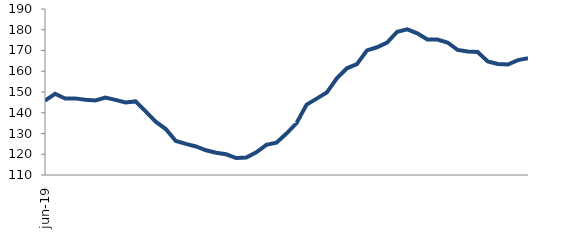
| Category | Series 1 |
|---|---|
| 2019-06-01 | 145.804 |
| 2019-07-01 | 149.147 |
| 2019-08-01 | 146.814 |
| 2019-09-01 | 146.921 |
| 2019-10-01 | 146.216 |
| 2019-11-01 | 145.952 |
| 2019-12-01 | 147.284 |
| 2020-01-01 | 146.194 |
| 2020-02-01 | 144.98 |
| 2020-03-01 | 145.471 |
| 2020-04-01 | 140.66 |
| 2020-05-01 | 135.678 |
| 2020-06-01 | 132.14 |
| 2020-07-01 | 126.404 |
| 2020-08-01 | 124.978 |
| 2020-09-01 | 123.76 |
| 2020-10-01 | 121.904 |
| 2020-11-01 | 120.729 |
| 2020-12-01 | 119.982 |
| 2021-01-01 | 118.16 |
| 2021-02-01 | 118.385 |
| 2021-03-01 | 120.897 |
| 2021-04-01 | 124.521 |
| 2021-05-01 | 125.561 |
| 2021-06-01 | 129.991 |
| 2021-07-01 | 135.036 |
| 2021-08-01 | 143.93 |
| 2021-09-01 | 146.816 |
| 2021-10-01 | 149.733 |
| 2021-11-01 | 156.598 |
| 2021-12-01 | 161.424 |
| 2022-01-01 | 163.409 |
| 2022-02-01 | 170.051 |
| 2022-03-01 | 171.561 |
| 2022-04-01 | 173.768 |
| 2022-05-01 | 179.049 |
| 2022-06-01 | 180.219 |
| 2022-07-01 | 178.235 |
| 2022-08-01 | 175.283 |
| 2022-09-01 | 175.244 |
| 2022-10-01 | 173.855 |
| 2022-11-01 | 170.303 |
| 2022-12-01 | 169.507 |
| 2023-01-01 | 169.264 |
| 2023-02-01 | 164.751 |
| 2023-03-01 | 163.49 |
| 2023-04-01 | 163.213 |
| 2023-05-01 | 165.362 |
| 2023-06-01 | 166.293 |